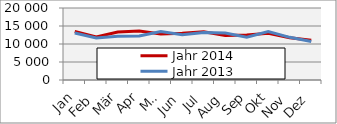
| Category | Jahr 2014 | Jahr 2013 |
|---|---|---|
| 0 | 13467.504 | 13045.842 |
| 1 | 11952.959 | 11695.552 |
| 2 | 13326.8 | 12119.16 |
| 3 | 13613.541 | 12224.413 |
| 4 | 12787.858 | 13460.982 |
| 5 | 12988.875 | 12585.538 |
| 6 | 13366.47 | 13216.086 |
| 7 | 12342.11 | 13027.384 |
| 8 | 12520.678 | 11873.605 |
| 9 | 13008.925 | 13464.67 |
| 10 | 11736.257 | 11853.609 |
| 11 | 11045.203 | 10707.603 |